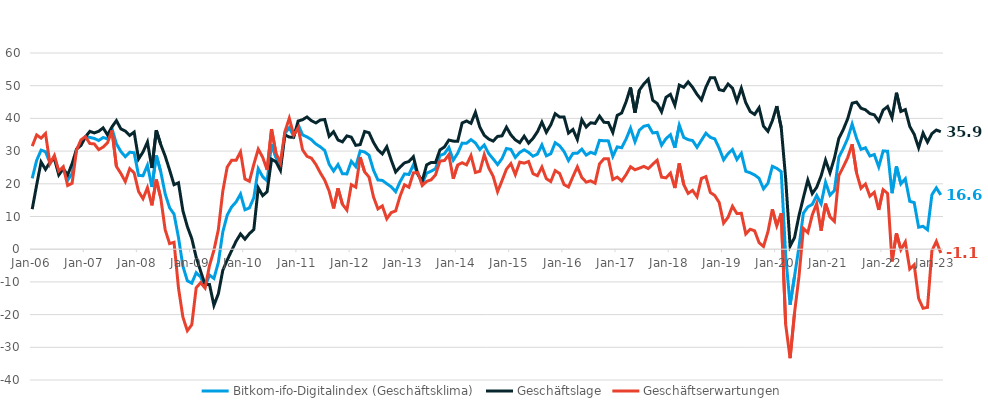
| Category | Bitkom-ifo-Digitalindex (Geschäftsklima) | Geschäftslage | Geschäftserwartungen |
|---|---|---|---|
| 2006-01-01 | 21.666 | 12.236 | 31.515 |
| 2006-02-01 | 27.152 | 19.629 | 34.932 |
| 2006-03-01 | 30.288 | 26.666 | 33.969 |
| 2006-04-01 | 29.822 | 24.4 | 35.376 |
| 2006-05-01 | 26.364 | 26.58 | 26.148 |
| 2006-06-01 | 28.188 | 27.732 | 28.645 |
| 2006-07-01 | 23.313 | 22.713 | 23.916 |
| 2006-08-01 | 24.895 | 24.588 | 25.202 |
| 2006-09-01 | 21.092 | 22.725 | 19.471 |
| 2006-10-01 | 23.135 | 26.154 | 20.156 |
| 2006-11-01 | 30.485 | 30.619 | 30.351 |
| 2006-12-01 | 32.573 | 31.725 | 33.424 |
| 2007-01-01 | 34.375 | 34.319 | 34.431 |
| 2007-02-01 | 34.171 | 36.04 | 32.317 |
| 2007-03-01 | 33.873 | 35.556 | 32.201 |
| 2007-04-01 | 33.239 | 36.06 | 30.452 |
| 2007-05-01 | 34.152 | 37.106 | 31.235 |
| 2007-06-01 | 33.759 | 34.94 | 32.583 |
| 2007-07-01 | 36.852 | 37.419 | 36.287 |
| 2007-08-01 | 32.205 | 39.321 | 25.3 |
| 2007-09-01 | 29.879 | 36.798 | 23.162 |
| 2007-10-01 | 28.285 | 36.142 | 20.689 |
| 2007-11-01 | 29.66 | 34.805 | 24.628 |
| 2007-12-01 | 29.486 | 35.816 | 23.325 |
| 2008-01-01 | 22.563 | 27.592 | 17.646 |
| 2008-02-01 | 22.471 | 29.734 | 15.438 |
| 2008-03-01 | 25.679 | 32.767 | 18.806 |
| 2008-04-01 | 19.044 | 24.825 | 13.412 |
| 2008-05-01 | 28.712 | 36.375 | 21.298 |
| 2008-06-01 | 23.699 | 32.023 | 15.674 |
| 2008-07-01 | 16.901 | 28.462 | 5.925 |
| 2008-08-01 | 12.663 | 24.211 | 1.71 |
| 2008-09-01 | 10.73 | 19.723 | 2.105 |
| 2008-10-01 | 3.604 | 20.308 | -11.833 |
| 2008-11-01 | -5.181 | 11.764 | -20.771 |
| 2008-12-01 | -9.665 | 6.925 | -24.924 |
| 2009-01-01 | -10.387 | 3.256 | -23.115 |
| 2009-02-01 | -7.203 | -2.492 | -11.802 |
| 2009-03-01 | -8.494 | -6.721 | -10.25 |
| 2009-04-01 | -11.362 | -10.85 | -11.873 |
| 2009-05-01 | -7.917 | -10.776 | -5.015 |
| 2009-06-01 | -8.937 | -17.171 | -0.333 |
| 2009-07-01 | -4.05 | -13.614 | 6.006 |
| 2009-08-01 | 5.282 | -6.45 | 17.727 |
| 2009-09-01 | 10.439 | -3.305 | 25.143 |
| 2009-10-01 | 12.946 | -0.414 | 27.2 |
| 2009-11-01 | 14.45 | 2.443 | 27.17 |
| 2009-12-01 | 16.853 | 4.668 | 29.764 |
| 2010-01-01 | 12.059 | 3.068 | 21.449 |
| 2010-02-01 | 12.615 | 4.756 | 20.775 |
| 2010-03-01 | 15.745 | 6.01 | 25.939 |
| 2010-04-01 | 24.602 | 18.757 | 30.604 |
| 2010-05-01 | 22.161 | 16.375 | 28.101 |
| 2010-06-01 | 20.895 | 17.58 | 24.261 |
| 2010-07-01 | 32.08 | 27.526 | 36.725 |
| 2010-08-01 | 28.066 | 26.737 | 29.402 |
| 2010-09-01 | 25.239 | 24.125 | 26.359 |
| 2010-10-01 | 35.407 | 34.953 | 35.862 |
| 2010-11-01 | 37.153 | 34.287 | 40.053 |
| 2010-12-01 | 34.58 | 34.23 | 34.931 |
| 2011-01-01 | 38.145 | 39.194 | 37.1 |
| 2011-02-01 | 34.96 | 39.61 | 30.4 |
| 2011-03-01 | 34.341 | 40.436 | 28.4 |
| 2011-04-01 | 33.494 | 39.295 | 27.834 |
| 2011-05-01 | 32.177 | 38.613 | 25.914 |
| 2011-06-01 | 31.297 | 39.504 | 23.371 |
| 2011-07-01 | 30.199 | 39.665 | 21.107 |
| 2011-08-01 | 25.984 | 34.527 | 17.752 |
| 2011-09-01 | 23.894 | 35.926 | 12.475 |
| 2011-10-01 | 25.881 | 33.386 | 18.617 |
| 2011-11-01 | 23.076 | 32.826 | 13.734 |
| 2011-12-01 | 23.022 | 34.655 | 11.965 |
| 2012-01-01 | 26.881 | 34.263 | 19.731 |
| 2012-02-01 | 25.278 | 31.754 | 18.983 |
| 2012-03-01 | 30.04 | 31.985 | 28.111 |
| 2012-04-01 | 29.745 | 35.996 | 23.659 |
| 2012-05-01 | 28.733 | 35.614 | 22.052 |
| 2012-06-01 | 24.182 | 32.668 | 16.004 |
| 2012-07-01 | 21.171 | 30.384 | 12.328 |
| 2012-08-01 | 21.038 | 29.132 | 13.229 |
| 2012-09-01 | 20.029 | 31.317 | 9.291 |
| 2012-10-01 | 19.085 | 27.266 | 11.198 |
| 2012-11-01 | 17.58 | 23.614 | 11.709 |
| 2012-12-01 | 20.639 | 25.127 | 16.241 |
| 2013-01-01 | 23.024 | 26.392 | 19.706 |
| 2013-02-01 | 22.852 | 26.831 | 18.944 |
| 2013-03-01 | 25.797 | 28.277 | 23.344 |
| 2013-04-01 | 23.164 | 22.881 | 23.448 |
| 2013-05-01 | 20.184 | 20.885 | 19.485 |
| 2013-06-01 | 23.25 | 25.787 | 20.742 |
| 2013-07-01 | 23.85 | 26.525 | 21.206 |
| 2013-08-01 | 24.622 | 26.524 | 22.736 |
| 2013-09-01 | 28.662 | 30.381 | 26.956 |
| 2013-10-01 | 29.174 | 31.25 | 27.118 |
| 2013-11-01 | 31.133 | 33.377 | 28.911 |
| 2013-12-01 | 27.231 | 33.056 | 21.552 |
| 2014-01-01 | 29.346 | 32.991 | 25.758 |
| 2014-02-01 | 32.439 | 38.592 | 26.444 |
| 2014-03-01 | 32.4 | 39.209 | 25.785 |
| 2014-04-01 | 33.51 | 38.492 | 28.631 |
| 2014-05-01 | 32.479 | 41.86 | 23.462 |
| 2014-06-01 | 30.48 | 37.314 | 23.843 |
| 2014-07-01 | 31.853 | 34.82 | 28.923 |
| 2014-08-01 | 29.233 | 33.68 | 24.871 |
| 2014-09-01 | 27.623 | 33.062 | 22.312 |
| 2014-10-01 | 25.884 | 34.5 | 17.585 |
| 2014-11-01 | 27.709 | 34.656 | 20.967 |
| 2014-12-01 | 30.804 | 37.323 | 24.465 |
| 2015-01-01 | 30.527 | 34.96 | 26.178 |
| 2015-02-01 | 28.063 | 33.444 | 22.806 |
| 2015-03-01 | 29.589 | 32.577 | 26.64 |
| 2015-04-01 | 30.4 | 34.563 | 26.311 |
| 2015-05-01 | 29.612 | 32.435 | 26.824 |
| 2015-06-01 | 28.433 | 33.907 | 23.087 |
| 2015-07-01 | 29.097 | 35.934 | 22.459 |
| 2015-08-01 | 31.9 | 38.874 | 25.13 |
| 2015-09-01 | 28.552 | 35.748 | 21.575 |
| 2015-10-01 | 29.188 | 38.018 | 20.686 |
| 2015-11-01 | 32.571 | 41.433 | 24.034 |
| 2015-12-01 | 31.62 | 40.412 | 23.15 |
| 2016-01-01 | 29.867 | 40.447 | 19.752 |
| 2016-02-01 | 27.114 | 35.513 | 19.016 |
| 2016-03-01 | 29.295 | 36.615 | 22.201 |
| 2016-04-01 | 29.334 | 33.558 | 25.187 |
| 2016-05-01 | 30.595 | 39.6 | 21.929 |
| 2016-06-01 | 28.775 | 37.355 | 20.505 |
| 2016-07-01 | 29.619 | 38.669 | 20.911 |
| 2016-08-01 | 29.141 | 38.457 | 20.19 |
| 2016-09-01 | 33.282 | 40.709 | 26.083 |
| 2016-10-01 | 33.162 | 38.812 | 27.645 |
| 2016-11-01 | 33.124 | 38.722 | 27.657 |
| 2016-12-01 | 28.383 | 35.682 | 21.309 |
| 2017-01-01 | 31.291 | 40.931 | 22.037 |
| 2017-02-01 | 31.023 | 41.654 | 20.859 |
| 2017-03-01 | 33.682 | 45.093 | 22.803 |
| 2017-04-01 | 37.021 | 49.444 | 25.217 |
| 2017-05-01 | 32.849 | 41.743 | 24.282 |
| 2017-06-01 | 36.414 | 48.644 | 24.786 |
| 2017-07-01 | 37.594 | 50.531 | 25.324 |
| 2017-08-01 | 37.915 | 51.966 | 24.647 |
| 2017-09-01 | 35.564 | 45.558 | 25.977 |
| 2017-10-01 | 35.733 | 44.575 | 27.21 |
| 2017-11-01 | 31.81 | 42.019 | 22.031 |
| 2017-12-01 | 33.809 | 46.454 | 21.814 |
| 2018-01-01 | 35.011 | 47.353 | 23.284 |
| 2018-02-01 | 31.014 | 44.018 | 18.702 |
| 2018-03-01 | 37.922 | 50.2 | 26.247 |
| 2018-04-01 | 34.176 | 49.502 | 19.791 |
| 2018-05-01 | 33.502 | 51.169 | 17.078 |
| 2018-06-01 | 33.221 | 49.51 | 17.995 |
| 2018-07-01 | 31.156 | 47.347 | 16.026 |
| 2018-08-01 | 33.339 | 45.64 | 21.655 |
| 2018-09-01 | 35.474 | 49.54 | 22.201 |
| 2018-10-01 | 34.213 | 52.405 | 17.331 |
| 2018-11-01 | 33.731 | 52.414 | 16.431 |
| 2018-12-01 | 30.89 | 48.781 | 14.286 |
| 2019-01-01 | 27.326 | 48.471 | 7.98 |
| 2019-02-01 | 29.224 | 50.509 | 9.747 |
| 2019-03-01 | 30.488 | 49.266 | 13.125 |
| 2019-04-01 | 27.424 | 45.252 | 10.892 |
| 2019-05-01 | 29.318 | 49.236 | 10.992 |
| 2019-06-01 | 23.828 | 44.788 | 4.663 |
| 2019-07-01 | 23.374 | 42.095 | 6.101 |
| 2019-08-01 | 22.704 | 41.214 | 5.615 |
| 2019-09-01 | 21.672 | 43.258 | 2.002 |
| 2019-10-01 | 18.462 | 37.641 | 0.83 |
| 2019-11-01 | 20.145 | 36.047 | 5.315 |
| 2019-12-01 | 25.353 | 39.295 | 12.224 |
| 2020-01-01 | 24.718 | 43.766 | 7.158 |
| 2020-02-01 | 23.709 | 37.172 | 11.01 |
| 2020-03-01 | -1.94 | 21.63 | -23.002 |
| 2020-04-01 | -17.015 | 0.907 | -33.338 |
| 2020-05-01 | -8.289 | 3.563 | -19.451 |
| 2020-06-01 | 0.693 | 10.228 | -8.409 |
| 2020-07-01 | 11.017 | 15.783 | 6.355 |
| 2020-08-01 | 12.947 | 21.147 | 5.052 |
| 2020-09-01 | 13.701 | 17.001 | 10.451 |
| 2020-10-01 | 16.43 | 18.944 | 13.944 |
| 2020-11-01 | 13.878 | 22.427 | 5.657 |
| 2020-12-01 | 20.485 | 27.239 | 13.931 |
| 2021-01-01 | 16.517 | 23.37 | 9.875 |
| 2021-02-01 | 17.956 | 27.845 | 8.496 |
| 2021-03-01 | 28.123 | 33.906 | 22.483 |
| 2021-04-01 | 30.802 | 36.585 | 25.161 |
| 2021-05-01 | 33.886 | 39.908 | 28.015 |
| 2021-06-01 | 38.288 | 44.647 | 32.095 |
| 2021-07-01 | 33.901 | 44.986 | 23.318 |
| 2021-08-01 | 30.534 | 43.11 | 18.608 |
| 2021-09-01 | 31.016 | 42.631 | 19.956 |
| 2021-10-01 | 28.493 | 41.472 | 16.212 |
| 2021-11-01 | 28.944 | 41.095 | 17.406 |
| 2021-12-01 | 25.176 | 39.161 | 12.009 |
| 2022-01-01 | 30.056 | 42.552 | 18.204 |
| 2022-02-01 | 29.948 | 43.625 | 17.039 |
| 2022-03-01 | 17.122 | 40.22 | -3.755 |
| 2022-04-01 | 25.341 | 47.854 | 4.873 |
| 2022-05-01 | 19.982 | 42.12 | -0.132 |
| 2022-06-01 | 21.544 | 42.704 | 2.23 |
| 2022-07-01 | 14.637 | 37.559 | -6.074 |
| 2022-08-01 | 14.257 | 35.137 | -4.768 |
| 2022-09-01 | 6.716 | 31.045 | -15.052 |
| 2022-10-01 | 7.001 | 35.516 | -18.061 |
| 2022-11-01 | 5.942 | 32.758 | -17.783 |
| 2022-12-01 | 16.678 | 35.345 | -0.508 |
| 2023-01-01 | 18.755 | 36.435 | 2.398 |
| 2023-02-01 | 16.596 | 35.924 | -1.149 |